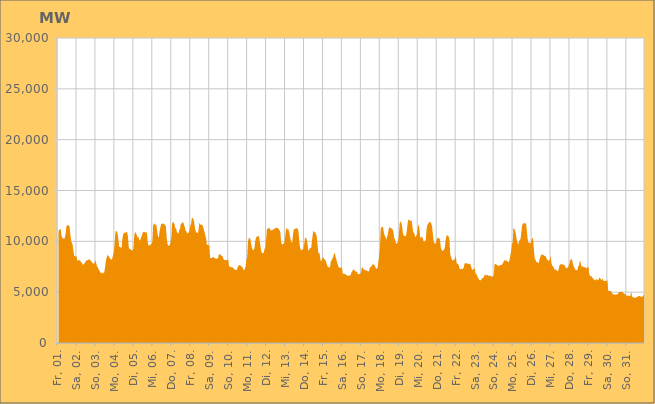
| Category | Series 0 |
|---|---|
|  Fr, 01.  | 10910.645 |
|  Fr, 01.  | 11161.053 |
|  Fr, 01.  | 11172.121 |
|  Fr, 01.  | 11181.072 |
|  Fr, 01.  | 10517.525 |
|  Fr, 01.  | 10327.249 |
|  Fr, 01.  | 10294.14 |
|  Fr, 01.  | 10254.104 |
|  Fr, 01.  | 10308.774 |
|  Fr, 01.  | 10670.514 |
|  Fr, 01.  | 11379.434 |
|  Fr, 01.  | 11614.211 |
|  Fr, 01.  | 11558.327 |
|  Fr, 01.  | 11572.868 |
|  Fr, 01.  | 11494.597 |
|  Fr, 01.  | 10799.871 |
|  Fr, 01.  | 10107.648 |
|  Sa, 02.  | 9832.797 |
|  Sa, 02.  | 9682.603 |
|  Sa, 02.  | 9065.426 |
|  Sa, 02.  | 8584.618 |
|  Sa, 02.  | 8520.133 |
|  Sa, 02.  | 8489.583 |
|  Sa, 02.  | 8554.326 |
|  Sa, 02.  | 8049.716 |
|  Sa, 02.  | 8132.994 |
|  Sa, 02.  | 8154.32 |
|  Sa, 02.  | 8128.275 |
|  Sa, 02.  | 8052.271 |
|  Sa, 02.  | 7940.616 |
|  Sa, 02.  | 7816.128 |
|  Sa, 02.  | 7703.871 |
|  Sa, 02.  | 7719.587 |
|  Sa, 02.  | 7819.812 |
|  Sa, 02.  | 7980.7 |
|  Sa, 02.  | 8072.026 |
|  Sa, 02.  | 8146.636 |
|  Sa, 02.  | 8133.465 |
|  Sa, 02.  | 8201.466 |
|  Sa, 02.  | 8229.115 |
|  Sa, 02.  | 8178.005 |
|  So, 03.  | 8105.695 |
|  So, 03.  | 7988.684 |
|  So, 03.  | 7883.575 |
|  So, 03.  | 7818.237 |
|  So, 03.  | 7803.891 |
|  So, 03.  | 7892.142 |
|  So, 03.  | 8143.584 |
|  So, 03.  | 7777.115 |
|  So, 03.  | 7539.364 |
|  So, 03.  | 7406.325 |
|  So, 03.  | 7226.764 |
|  So, 03.  | 7086.98 |
|  So, 03.  | 6957.561 |
|  So, 03.  | 6875.876 |
|  So, 03.  | 6830.251 |
|  So, 03.  | 6942.351 |
|  So, 03.  | 6855.817 |
|  So, 03.  | 6918.674 |
|  So, 03.  | 7391.467 |
|  So, 03.  | 8034.989 |
|  So, 03.  | 8375.92 |
|  So, 03.  | 8687.333 |
|  So, 03.  | 8574.529 |
|  So, 03.  | 8492.711 |
|  Mo, 04.  | 8370.189 |
|  Mo, 04.  | 8230.182 |
|  Mo, 04.  | 8207.853 |
|  Mo, 04.  | 8237.067 |
|  Mo, 04.  | 8577.759 |
|  Mo, 04.  | 8820.048 |
|  Mo, 04.  | 9562.94 |
|  Mo, 04.  | 10770.615 |
|  Mo, 04.  | 11056.903 |
|  Mo, 04.  | 10963.38 |
|  Mo, 04.  | 10740.871 |
|  Mo, 04.  | 10142.492 |
|  Mo, 04.  | 9463.519 |
|  Mo, 04.  | 9456.889 |
|  Mo, 04.  | 9383.863 |
|  Mo, 04.  | 9366.527 |
|  Mo, 04.  | 10226.689 |
|  Mo, 04.  | 10690.396 |
|  Mo, 04.  | 10846.733 |
|  Mo, 04.  | 10848.995 |
|  Mo, 04.  | 10830.381 |
|  Mo, 04.  | 10949.305 |
|  Mo, 04.  | 10883.396 |
|  Mo, 04.  | 10500.323 |
|  Di, 05.  | 9440.573 |
|  Di, 05.  | 9218.752 |
|  Di, 05.  | 9250.562 |
|  Di, 05.  | 9186.888 |
|  Di, 05.  | 9098.444 |
|  Di, 05.  | 9118.396 |
|  Di, 05.  | 9299.131 |
|  Di, 05.  | 10538.89 |
|  Di, 05.  | 10911.658 |
|  Di, 05.  | 10854.185 |
|  Di, 05.  | 10621.414 |
|  Di, 05.  | 10379.12 |
|  Di, 05.  | 10526.984 |
|  Di, 05.  | 10202.525 |
|  Di, 05.  | 10069.625 |
|  Di, 05.  | 10213.693 |
|  Di, 05.  | 10446.211 |
|  Di, 05.  | 10684.358 |
|  Di, 05.  | 10873.97 |
|  Di, 05.  | 10940.775 |
|  Di, 05.  | 10901.387 |
|  Di, 05.  | 10891.43 |
|  Di, 05.  | 10857.715 |
|  Di, 05.  | 10888.144 |
|  Mi, 06.  | 9951.406 |
|  Mi, 06.  | 9592.29 |
|  Mi, 06.  | 9594.636 |
|  Mi, 06.  | 9639.295 |
|  Mi, 06.  | 9713.401 |
|  Mi, 06.  | 9723.913 |
|  Mi, 06.  | 10012.16 |
|  Mi, 06.  | 11568.808 |
|  Mi, 06.  | 11719.892 |
|  Mi, 06.  | 11756.922 |
|  Mi, 06.  | 11589.679 |
|  Mi, 06.  | 11597.96 |
|  Mi, 06.  | 11052.937 |
|  Mi, 06.  | 10497.009 |
|  Mi, 06.  | 10351.914 |
|  Mi, 06.  | 10937.036 |
|  Mi, 06.  | 11338.492 |
|  Mi, 06.  | 11670.341 |
|  Mi, 06.  | 11703.959 |
|  Mi, 06.  | 11749.606 |
|  Mi, 06.  | 11763.94 |
|  Mi, 06.  | 11654.189 |
|  Mi, 06.  | 11655.013 |
|  Mi, 06.  | 11450.721 |
|  Do, 07.  | 10445.446 |
|  Do, 07.  | 9757.796 |
|  Do, 07.  | 9545.986 |
|  Do, 07.  | 9599.373 |
|  Do, 07.  | 9632.078 |
|  Do, 07.  | 9865.247 |
|  Do, 07.  | 10426.123 |
|  Do, 07.  | 11770.087 |
|  Do, 07.  | 11882.164 |
|  Do, 07.  | 11860.763 |
|  Do, 07.  | 11669.899 |
|  Do, 07.  | 11277.946 |
|  Do, 07.  | 11245.452 |
|  Do, 07.  | 10900.701 |
|  Do, 07.  | 10806.399 |
|  Do, 07.  | 10745.665 |
|  Do, 07.  | 11134.93 |
|  Do, 07.  | 11241.189 |
|  Do, 07.  | 11713.393 |
|  Do, 07.  | 11781.794 |
|  Do, 07.  | 11850.703 |
|  Do, 07.  | 11884.029 |
|  Do, 07.  | 11627.665 |
|  Do, 07.  | 11376.801 |
|  Fr, 08.  | 11088.853 |
|  Fr, 08.  | 10979.826 |
|  Fr, 08.  | 10768.369 |
|  Fr, 08.  | 10805.953 |
|  Fr, 08.  | 10894.563 |
|  Fr, 08.  | 11130.341 |
|  Fr, 08.  | 11535.535 |
|  Fr, 08.  | 11746.984 |
|  Fr, 08.  | 12333.374 |
|  Fr, 08.  | 12278.405 |
|  Fr, 08.  | 12169.046 |
|  Fr, 08.  | 11808.216 |
|  Fr, 08.  | 11233.73 |
|  Fr, 08.  | 10959.879 |
|  Fr, 08.  | 10850.083 |
|  Fr, 08.  | 10790.447 |
|  Fr, 08.  | 10899.098 |
|  Fr, 08.  | 11591.269 |
|  Fr, 08.  | 11854.353 |
|  Fr, 08.  | 11614.369 |
|  Fr, 08.  | 11637.197 |
|  Fr, 08.  | 11614.535 |
|  Fr, 08.  | 11485.008 |
|  Fr, 08.  | 11192.539 |
|  Sa, 09.  | 10896.988 |
|  Sa, 09.  | 10611.094 |
|  Sa, 09.  | 10259.289 |
|  Sa, 09.  | 9619.333 |
|  Sa, 09.  | 9686.262 |
|  Sa, 09.  | 9590.657 |
|  Sa, 09.  | 9702.992 |
|  Sa, 09.  | 8396.872 |
|  Sa, 09.  | 8354.791 |
|  Sa, 09.  | 8344.799 |
|  Sa, 09.  | 8432.022 |
|  Sa, 09.  | 8441.325 |
|  Sa, 09.  | 8434.419 |
|  Sa, 09.  | 8318.6 |
|  Sa, 09.  | 8309.493 |
|  Sa, 09.  | 8278.586 |
|  Sa, 09.  | 8301.05 |
|  Sa, 09.  | 8344.111 |
|  Sa, 09.  | 8660.319 |
|  Sa, 09.  | 8772.652 |
|  Sa, 09.  | 8682.322 |
|  Sa, 09.  | 8598.227 |
|  Sa, 09.  | 8572.003 |
|  Sa, 09.  | 8487.638 |
|  So, 10.  | 8258.678 |
|  So, 10.  | 8180.549 |
|  So, 10.  | 8145.402 |
|  So, 10.  | 8171.195 |
|  So, 10.  | 8131.86 |
|  So, 10.  | 8161.209 |
|  So, 10.  | 8245.408 |
|  So, 10.  | 7511.418 |
|  So, 10.  | 7535.942 |
|  So, 10.  | 7465.569 |
|  So, 10.  | 7445.137 |
|  So, 10.  | 7489.881 |
|  So, 10.  | 7372.418 |
|  So, 10.  | 7332.622 |
|  So, 10.  | 7216.862 |
|  So, 10.  | 7180.31 |
|  So, 10.  | 7218.987 |
|  So, 10.  | 7197.302 |
|  So, 10.  | 7470.222 |
|  So, 10.  | 7625.154 |
|  So, 10.  | 7665.391 |
|  So, 10.  | 7625.024 |
|  So, 10.  | 7592.112 |
|  So, 10.  | 7526.211 |
|  Mo, 11.  | 7439.424 |
|  Mo, 11.  | 7235.767 |
|  Mo, 11.  | 7194.782 |
|  Mo, 11.  | 7243.613 |
|  Mo, 11.  | 7568.246 |
|  Mo, 11.  | 8179.835 |
|  Mo, 11.  | 8451.679 |
|  Mo, 11.  | 9958.05 |
|  Mo, 11.  | 10371.492 |
|  Mo, 11.  | 10303.274 |
|  Mo, 11.  | 10184.033 |
|  Mo, 11.  | 9745.031 |
|  Mo, 11.  | 9336.933 |
|  Mo, 11.  | 9156.065 |
|  Mo, 11.  | 9157.147 |
|  Mo, 11.  | 9270.148 |
|  Mo, 11.  | 9924.5 |
|  Mo, 11.  | 10318.615 |
|  Mo, 11.  | 10456.391 |
|  Mo, 11.  | 10480.06 |
|  Mo, 11.  | 10567.251 |
|  Mo, 11.  | 10400.14 |
|  Mo, 11.  | 9947.901 |
|  Mo, 11.  | 9437.846 |
|  Di, 12.  | 8967.623 |
|  Di, 12.  | 8821.736 |
|  Di, 12.  | 8850.547 |
|  Di, 12.  | 8881.123 |
|  Di, 12.  | 9264.496 |
|  Di, 12.  | 9405.256 |
|  Di, 12.  | 10248.692 |
|  Di, 12.  | 11247.167 |
|  Di, 12.  | 11243.315 |
|  Di, 12.  | 11292.049 |
|  Di, 12.  | 11350.262 |
|  Di, 12.  | 11163.491 |
|  Di, 12.  | 11072.907 |
|  Di, 12.  | 11085.573 |
|  Di, 12.  | 11108.314 |
|  Di, 12.  | 11152.783 |
|  Di, 12.  | 11227.799 |
|  Di, 12.  | 11253.219 |
|  Di, 12.  | 11336.892 |
|  Di, 12.  | 11335.396 |
|  Di, 12.  | 11328.123 |
|  Di, 12.  | 11296.399 |
|  Di, 12.  | 11172.215 |
|  Di, 12.  | 11103.185 |
|  Mi, 13.  | 10842.388 |
|  Mi, 13.  | 9890.581 |
|  Mi, 13.  | 9692.068 |
|  Mi, 13.  | 9696.355 |
|  Mi, 13.  | 9773.247 |
|  Mi, 13.  | 9859.029 |
|  Mi, 13.  | 10426.092 |
|  Mi, 13.  | 11091.143 |
|  Mi, 13.  | 11378.214 |
|  Mi, 13.  | 11161.806 |
|  Mi, 13.  | 11189.162 |
|  Mi, 13.  | 10943.071 |
|  Mi, 13.  | 10520.554 |
|  Mi, 13.  | 10176.665 |
|  Mi, 13.  | 9899.614 |
|  Mi, 13.  | 9863.645 |
|  Mi, 13.  | 10714.805 |
|  Mi, 13.  | 11188.049 |
|  Mi, 13.  | 11181.051 |
|  Mi, 13.  | 11257.007 |
|  Mi, 13.  | 11294.254 |
|  Mi, 13.  | 11274.766 |
|  Mi, 13.  | 11223.879 |
|  Mi, 13.  | 10905.301 |
|  Do, 14.  | 9926.415 |
|  Do, 14.  | 9358.923 |
|  Do, 14.  | 9119.12 |
|  Do, 14.  | 9173.914 |
|  Do, 14.  | 9169.206 |
|  Do, 14.  | 9277.768 |
|  Do, 14.  | 9628.271 |
|  Do, 14.  | 10235.854 |
|  Do, 14.  | 10399.263 |
|  Do, 14.  | 10273.521 |
|  Do, 14.  | 9946.701 |
|  Do, 14.  | 9241.505 |
|  Do, 14.  | 9033.529 |
|  Do, 14.  | 9321.132 |
|  Do, 14.  | 9328.912 |
|  Do, 14.  | 9375.751 |
|  Do, 14.  | 10037.726 |
|  Do, 14.  | 10712.723 |
|  Do, 14.  | 11066.786 |
|  Do, 14.  | 10881.823 |
|  Do, 14.  | 10922.827 |
|  Do, 14.  | 10721.081 |
|  Do, 14.  | 10489.778 |
|  Do, 14.  | 9648.203 |
|  Fr, 15.  | 8779.219 |
|  Fr, 15.  | 8944.095 |
|  Fr, 15.  | 8597.611 |
|  Fr, 15.  | 8058.143 |
|  Fr, 15.  | 8090.277 |
|  Fr, 15.  | 8265.577 |
|  Fr, 15.  | 8497.444 |
|  Fr, 15.  | 8309.106 |
|  Fr, 15.  | 8202.021 |
|  Fr, 15.  | 8169.546 |
|  Fr, 15.  | 7924.613 |
|  Fr, 15.  | 7677.365 |
|  Fr, 15.  | 7483.778 |
|  Fr, 15.  | 7490.531 |
|  Fr, 15.  | 7388.348 |
|  Fr, 15.  | 7529.272 |
|  Fr, 15.  | 8077.529 |
|  Fr, 15.  | 8160.959 |
|  Fr, 15.  | 8331.532 |
|  Fr, 15.  | 8500.275 |
|  Fr, 15.  | 8807.698 |
|  Fr, 15.  | 8825.159 |
|  Fr, 15.  | 8430.199 |
|  Fr, 15.  | 8171.791 |
|  Sa, 16.  | 7847.232 |
|  Sa, 16.  | 7594.96 |
|  Sa, 16.  | 7427.439 |
|  Sa, 16.  | 7389.761 |
|  Sa, 16.  | 7427.298 |
|  Sa, 16.  | 7398.766 |
|  Sa, 16.  | 7401.407 |
|  Sa, 16.  | 6750.243 |
|  Sa, 16.  | 6838.401 |
|  Sa, 16.  | 6811.372 |
|  Sa, 16.  | 6763.03 |
|  Sa, 16.  | 6738.614 |
|  Sa, 16.  | 6648.32 |
|  Sa, 16.  | 6638.237 |
|  Sa, 16.  | 6580.744 |
|  Sa, 16.  | 6618.13 |
|  Sa, 16.  | 6669.121 |
|  Sa, 16.  | 6680.093 |
|  Sa, 16.  | 6979.867 |
|  Sa, 16.  | 7053.667 |
|  Sa, 16.  | 7244.927 |
|  Sa, 16.  | 7193.845 |
|  Sa, 16.  | 7125.68 |
|  Sa, 16.  | 7030.462 |
|  So, 17.  | 7025.535 |
|  So, 17.  | 6999.212 |
|  So, 17.  | 6796.085 |
|  So, 17.  | 6751.996 |
|  So, 17.  | 6778.013 |
|  So, 17.  | 6837.54 |
|  So, 17.  | 6900.505 |
|  So, 17.  | 7413.298 |
|  So, 17.  | 7447.336 |
|  So, 17.  | 7298.617 |
|  So, 17.  | 7201.774 |
|  So, 17.  | 7182.814 |
|  So, 17.  | 7142.319 |
|  So, 17.  | 7144.822 |
|  So, 17.  | 7094.223 |
|  So, 17.  | 7058.53 |
|  So, 17.  | 7036.732 |
|  So, 17.  | 7358.848 |
|  So, 17.  | 7484.553 |
|  So, 17.  | 7497.058 |
|  So, 17.  | 7671.6 |
|  So, 17.  | 7744.056 |
|  So, 17.  | 7725.55 |
|  So, 17.  | 7692.274 |
|  Mo, 18.  | 7458.547 |
|  Mo, 18.  | 7387.494 |
|  Mo, 18.  | 7248.232 |
|  Mo, 18.  | 7409.202 |
|  Mo, 18.  | 7966.825 |
|  Mo, 18.  | 8612.918 |
|  Mo, 18.  | 9358.973 |
|  Mo, 18.  | 11276.18 |
|  Mo, 18.  | 11370.97 |
|  Mo, 18.  | 11449.833 |
|  Mo, 18.  | 11368.04 |
|  Mo, 18.  | 10847.267 |
|  Mo, 18.  | 10542.494 |
|  Mo, 18.  | 10432.12 |
|  Mo, 18.  | 10145.379 |
|  Mo, 18.  | 10412.742 |
|  Mo, 18.  | 10683.877 |
|  Mo, 18.  | 11174.184 |
|  Mo, 18.  | 11386.512 |
|  Mo, 18.  | 11365.555 |
|  Mo, 18.  | 11262.055 |
|  Mo, 18.  | 11262.197 |
|  Mo, 18.  | 11154.528 |
|  Mo, 18.  | 10954.442 |
|  Di, 19.  | 10355.873 |
|  Di, 19.  | 10176.746 |
|  Di, 19.  | 9895.608 |
|  Di, 19.  | 9730.76 |
|  Di, 19.  | 9845.081 |
|  Di, 19.  | 9999.913 |
|  Di, 19.  | 10655.587 |
|  Di, 19.  | 11825.249 |
|  Di, 19.  | 11981.99 |
|  Di, 19.  | 11821.051 |
|  Di, 19.  | 11547.05 |
|  Di, 19.  | 10837.598 |
|  Di, 19.  | 10569.716 |
|  Di, 19.  | 10535.217 |
|  Di, 19.  | 10499.466 |
|  Di, 19.  | 10556.847 |
|  Di, 19.  | 11039.381 |
|  Di, 19.  | 11749.206 |
|  Di, 19.  | 12144.556 |
|  Di, 19.  | 12089.322 |
|  Di, 19.  | 12059.487 |
|  Di, 19.  | 11997.229 |
|  Di, 19.  | 12045.064 |
|  Di, 19.  | 11553.864 |
|  Mi, 20.  | 10898.305 |
|  Mi, 20.  | 10873.279 |
|  Mi, 20.  | 10609.457 |
|  Mi, 20.  | 10386.428 |
|  Mi, 20.  | 10558.154 |
|  Mi, 20.  | 10752.861 |
|  Mi, 20.  | 11449.394 |
|  Mi, 20.  | 11667.175 |
|  Mi, 20.  | 11233.393 |
|  Mi, 20.  | 10338.83 |
|  Mi, 20.  | 10361.891 |
|  Mi, 20.  | 10521.727 |
|  Mi, 20.  | 10326.852 |
|  Mi, 20.  | 10056.891 |
|  Mi, 20.  | 10002.743 |
|  Mi, 20.  | 9978.105 |
|  Mi, 20.  | 10131.833 |
|  Mi, 20.  | 11211.403 |
|  Mi, 20.  | 11600.405 |
|  Mi, 20.  | 11719.251 |
|  Mi, 20.  | 11846.723 |
|  Mi, 20.  | 11902.163 |
|  Mi, 20.  | 11907.297 |
|  Mi, 20.  | 11736.719 |
|  Do, 21.  | 11455.58 |
|  Do, 21.  | 10706.724 |
|  Do, 21.  | 9961.548 |
|  Do, 21.  | 9826.2 |
|  Do, 21.  | 9759.951 |
|  Do, 21.  | 9808.397 |
|  Do, 21.  | 10258.34 |
|  Do, 21.  | 10331.447 |
|  Do, 21.  | 10352.206 |
|  Do, 21.  | 10262.834 |
|  Do, 21.  | 10218.55 |
|  Do, 21.  | 9394.496 |
|  Do, 21.  | 9186.323 |
|  Do, 21.  | 9043.22 |
|  Do, 21.  | 9107.587 |
|  Do, 21.  | 9187.026 |
|  Do, 21.  | 9306.355 |
|  Do, 21.  | 10008.582 |
|  Do, 21.  | 10495.497 |
|  Do, 21.  | 10640.206 |
|  Do, 21.  | 10525.512 |
|  Do, 21.  | 10482.177 |
|  Do, 21.  | 10114.218 |
|  Do, 21.  | 8729.548 |
|  Fr, 22.  | 8490.543 |
|  Fr, 22.  | 8196.609 |
|  Fr, 22.  | 8120.235 |
|  Fr, 22.  | 8135.826 |
|  Fr, 22.  | 8217.115 |
|  Fr, 22.  | 8240.088 |
|  Fr, 22.  | 8605.783 |
|  Fr, 22.  | 7860.753 |
|  Fr, 22.  | 7798.08 |
|  Fr, 22.  | 7750.344 |
|  Fr, 22.  | 7576.487 |
|  Fr, 22.  | 7301.29 |
|  Fr, 22.  | 7242.274 |
|  Fr, 22.  | 7269.051 |
|  Fr, 22.  | 7278.887 |
|  Fr, 22.  | 7309.653 |
|  Fr, 22.  | 7399.1 |
|  Fr, 22.  | 7783.456 |
|  Fr, 22.  | 7853.479 |
|  Fr, 22.  | 7843.185 |
|  Fr, 22.  | 7851.489 |
|  Fr, 22.  | 7795.401 |
|  Fr, 22.  | 7791.009 |
|  Fr, 22.  | 7765.645 |
|  Sa, 23.  | 7799.003 |
|  Sa, 23.  | 7639.176 |
|  Sa, 23.  | 7335.453 |
|  Sa, 23.  | 7188.647 |
|  Sa, 23.  | 7230.007 |
|  Sa, 23.  | 7261.274 |
|  Sa, 23.  | 7413.01 |
|  Sa, 23.  | 6830.321 |
|  Sa, 23.  | 6814.469 |
|  Sa, 23.  | 6593.765 |
|  Sa, 23.  | 6406.606 |
|  Sa, 23.  | 6336.569 |
|  Sa, 23.  | 6186.647 |
|  Sa, 23.  | 6161.229 |
|  Sa, 23.  | 6184.315 |
|  Sa, 23.  | 6365.262 |
|  Sa, 23.  | 6376.279 |
|  Sa, 23.  | 6420.877 |
|  Sa, 23.  | 6604.721 |
|  Sa, 23.  | 6761.175 |
|  Sa, 23.  | 6625.651 |
|  Sa, 23.  | 6678.964 |
|  Sa, 23.  | 6704.628 |
|  Sa, 23.  | 6623.996 |
|  So, 24.  | 6606.327 |
|  So, 24.  | 6607.439 |
|  So, 24.  | 6614.976 |
|  So, 24.  | 6554.994 |
|  So, 24.  | 6500.558 |
|  So, 24.  | 6585.25 |
|  So, 24.  | 6613.321 |
|  So, 24.  | 7722.948 |
|  So, 24.  | 7792.658 |
|  So, 24.  | 7734.693 |
|  So, 24.  | 7704.382 |
|  So, 24.  | 7613.115 |
|  So, 24.  | 7557.525 |
|  So, 24.  | 7620.889 |
|  So, 24.  | 7667.422 |
|  So, 24.  | 7656.93 |
|  So, 24.  | 7661.468 |
|  So, 24.  | 7797.007 |
|  So, 24.  | 7884.151 |
|  So, 24.  | 8101.718 |
|  So, 24.  | 8138.24 |
|  So, 24.  | 8071.617 |
|  So, 24.  | 8129.833 |
|  So, 24.  | 8074.738 |
|  Mo, 25.  | 8000.612 |
|  Mo, 25.  | 7918.578 |
|  Mo, 25.  | 8159.348 |
|  Mo, 25.  | 8586.683 |
|  Mo, 25.  | 9011.085 |
|  Mo, 25.  | 9722.898 |
|  Mo, 25.  | 9869.303 |
|  Mo, 25.  | 11338.026 |
|  Mo, 25.  | 11219.498 |
|  Mo, 25.  | 11090.827 |
|  Mo, 25.  | 10750.497 |
|  Mo, 25.  | 10240.573 |
|  Mo, 25.  | 9898.018 |
|  Mo, 25.  | 9637.778 |
|  Mo, 25.  | 9990.727 |
|  Mo, 25.  | 10145.189 |
|  Mo, 25.  | 10227.118 |
|  Mo, 25.  | 10887.452 |
|  Mo, 25.  | 11596.555 |
|  Mo, 25.  | 11704.724 |
|  Mo, 25.  | 11797.157 |
|  Mo, 25.  | 11773.551 |
|  Mo, 25.  | 11787.15 |
|  Mo, 25.  | 11732.745 |
|  Di, 26.  | 10945.836 |
|  Di, 26.  | 10224.626 |
|  Di, 26.  | 9859.187 |
|  Di, 26.  | 9854.758 |
|  Di, 26.  | 9847.139 |
|  Di, 26.  | 9814.148 |
|  Di, 26.  | 10235.135 |
|  Di, 26.  | 10376.185 |
|  Di, 26.  | 10124.105 |
|  Di, 26.  | 9001.77 |
|  Di, 26.  | 8298.406 |
|  Di, 26.  | 8163.259 |
|  Di, 26.  | 7969.544 |
|  Di, 26.  | 7963.625 |
|  Di, 26.  | 7904.323 |
|  Di, 26.  | 7845.639 |
|  Di, 26.  | 8229.074 |
|  Di, 26.  | 8465.682 |
|  Di, 26.  | 8659.249 |
|  Di, 26.  | 8726.914 |
|  Di, 26.  | 8659.882 |
|  Di, 26.  | 8652.446 |
|  Di, 26.  | 8595.126 |
|  Di, 26.  | 8557.36 |
|  Mi, 27.  | 8481.166 |
|  Mi, 27.  | 8301.89 |
|  Mi, 27.  | 8185.39 |
|  Mi, 27.  | 8080.175 |
|  Mi, 27.  | 8095.317 |
|  Mi, 27.  | 8206.286 |
|  Mi, 27.  | 8593.624 |
|  Mi, 27.  | 7905.019 |
|  Mi, 27.  | 7572.661 |
|  Mi, 27.  | 7570.6 |
|  Mi, 27.  | 7418.674 |
|  Mi, 27.  | 7207.714 |
|  Mi, 27.  | 7226.021 |
|  Mi, 27.  | 7225.742 |
|  Mi, 27.  | 7096.785 |
|  Mi, 27.  | 7073.343 |
|  Mi, 27.  | 7159.45 |
|  Mi, 27.  | 7572.29 |
|  Mi, 27.  | 7747.52 |
|  Mi, 27.  | 7709.769 |
|  Mi, 27.  | 7768.742 |
|  Mi, 27.  | 7735.161 |
|  Mi, 27.  | 7713.934 |
|  Mi, 27.  | 7624.676 |
|  Do, 28.  | 7686.177 |
|  Do, 28.  | 7404.855 |
|  Do, 28.  | 7337.923 |
|  Do, 28.  | 7414.343 |
|  Do, 28.  | 7430.818 |
|  Do, 28.  | 7629.979 |
|  Do, 28.  | 7864.033 |
|  Do, 28.  | 8198.83 |
|  Do, 28.  | 8210.264 |
|  Do, 28.  | 8244.8 |
|  Do, 28.  | 7874.382 |
|  Do, 28.  | 7586.078 |
|  Do, 28.  | 7452.605 |
|  Do, 28.  | 7245.069 |
|  Do, 28.  | 7187.874 |
|  Do, 28.  | 7142.06 |
|  Do, 28.  | 7216.481 |
|  Do, 28.  | 7528.897 |
|  Do, 28.  | 7632.622 |
|  Do, 28.  | 8056.224 |
|  Do, 28.  | 7990.248 |
|  Do, 28.  | 7486.944 |
|  Do, 28.  | 7519.791 |
|  Do, 28.  | 7565.31 |
|  Fr, 29.  | 7411.077 |
|  Fr, 29.  | 7465.675 |
|  Fr, 29.  | 7449.116 |
|  Fr, 29.  | 7371.536 |
|  Fr, 29.  | 7363.744 |
|  Fr, 29.  | 7463.665 |
|  Fr, 29.  | 7514.562 |
|  Fr, 29.  | 6746.127 |
|  Fr, 29.  | 6598.797 |
|  Fr, 29.  | 6532.693 |
|  Fr, 29.  | 6566.002 |
|  Fr, 29.  | 6429.402 |
|  Fr, 29.  | 6268.296 |
|  Fr, 29.  | 6260.791 |
|  Fr, 29.  | 6177.525 |
|  Fr, 29.  | 6165.729 |
|  Fr, 29.  | 6283.445 |
|  Fr, 29.  | 6278.924 |
|  Fr, 29.  | 6143.632 |
|  Fr, 29.  | 6314.488 |
|  Fr, 29.  | 6429.702 |
|  Fr, 29.  | 6384.331 |
|  Fr, 29.  | 6162.841 |
|  Fr, 29.  | 6281.693 |
|  Sa, 30.  | 6304.644 |
|  Sa, 30.  | 6099.04 |
|  Sa, 30.  | 6116.909 |
|  Sa, 30.  | 6091.237 |
|  Sa, 30.  | 6113.423 |
|  Sa, 30.  | 6131.303 |
|  Sa, 30.  | 6137.629 |
|  Sa, 30.  | 5107.966 |
|  Sa, 30.  | 5110.944 |
|  Sa, 30.  | 5138.129 |
|  Sa, 30.  | 5089.937 |
|  Sa, 30.  | 5033.349 |
|  Sa, 30.  | 4886.827 |
|  Sa, 30.  | 4800.941 |
|  Sa, 30.  | 4795.748 |
|  Sa, 30.  | 4744.725 |
|  Sa, 30.  | 4759.459 |
|  Sa, 30.  | 4778.683 |
|  Sa, 30.  | 4786.389 |
|  Sa, 30.  | 4789.009 |
|  Sa, 30.  | 4949.049 |
|  Sa, 30.  | 5043.68 |
|  Sa, 30.  | 5000.254 |
|  Sa, 30.  | 5044.096 |
|  So, 31.  | 5016.783 |
|  So, 31.  | 4994.213 |
|  So, 31.  | 4969.081 |
|  So, 31.  | 4786.219 |
|  So, 31.  | 4831.924 |
|  So, 31.  | 4860.633 |
|  So, 31.  | 4582.092 |
|  So, 31.  | 4643.303 |
|  So, 31.  | 4679.619 |
|  So, 31.  | 4657.383 |
|  So, 31.  | 4591.62 |
|  So, 31.  | 4649.41 |
|  So, 31.  | 5076.654 |
|  So, 31.  | 4621.838 |
|  So, 31.  | 4497.81 |
|  So, 31.  | 4482.959 |
|  So, 31.  | 4451.177 |
|  So, 31.  | 4466.559 |
|  So, 31.  | 4468.019 |
|  So, 31.  | 4502.598 |
|  So, 31.  | 4548.744 |
|  So, 31.  | 4614.447 |
|  So, 31.  | 4615.149 |
|  Mo, 01.  | 4603.128 |
|  Mo, 01.  | 4583.615 |
|  Mo, 01.  | 4522.182 |
|  Mo, 01.  | 4553.42 |
|  Mo, 01.  | 4623.744 |
|  Mo, 01.  | 4744.013 |
|    | 4828.04 |